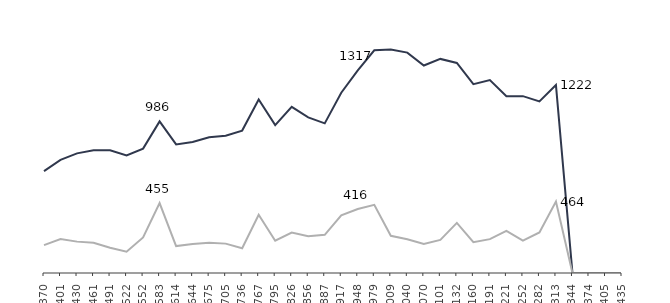
| Category | Bestand | Zugang |
|---|---|---|
| 42370 | 662 | 181 |
| 42401 | 736 | 221 |
| 42430 | 778 | 204 |
| 42461 | 798 | 197 |
| 42491 | 798 | 164 |
| 42522 | 764 | 138 |
| 42552 | 809 | 231 |
| 42583 | 986 | 455 |
| 42614 | 836 | 175 |
| 42644 | 852 | 188 |
| 42675 | 883 | 197 |
| 42705 | 892 | 191 |
| 42736 | 926 | 161 |
| 42767 | 1128 | 379 |
| 42795 | 962 | 210 |
| 42826 | 1080 | 263 |
| 42856 | 1012 | 239 |
| 42887 | 973 | 248 |
| 42917 | 1172 | 375 |
| 42948 | 1317 | 416 |
| 42979 | 1448 | 443 |
| 43009 | 1453 | 242 |
| 43040 | 1433 | 219 |
| 43070 | 1349 | 189 |
| 43101 | 1392 | 215 |
| 43132 | 1366 | 326 |
| 43160 | 1228 | 200 |
| 43191 | 1254 | 220 |
| 43221 | 1150 | 274 |
| 43252 | 1150 | 211 |
| 43282 | 1116 | 264 |
| 43313 | 1222 | 464 |
| 43344 | 0 | 0 |
| 43374 | 0 | 0 |
| 43405 | 0 | 0 |
| 43435 | 0 | 0 |